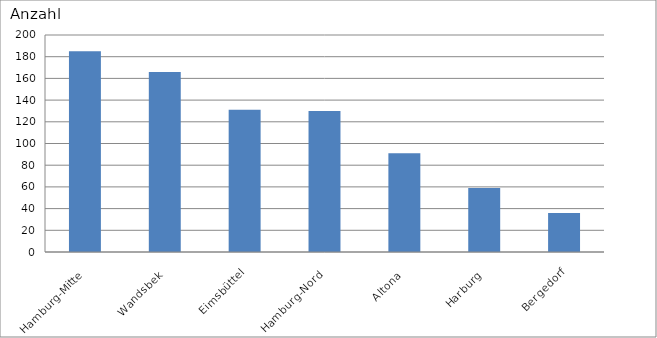
| Category | Hamburg-Mitte Wandsbek Eimsbüttel Hamburg-Nord Altona Harburg Bergedorf |
|---|---|
| Hamburg-Mitte | 185 |
| Wandsbek | 166 |
| Eimsbüttel | 131 |
| Hamburg-Nord | 130 |
| Altona | 91 |
| Harburg | 59 |
| Bergedorf | 36 |